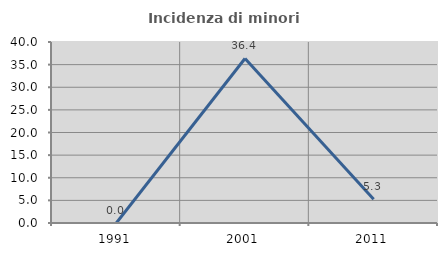
| Category | Incidenza di minori stranieri |
|---|---|
| 1991.0 | 0 |
| 2001.0 | 36.364 |
| 2011.0 | 5.263 |